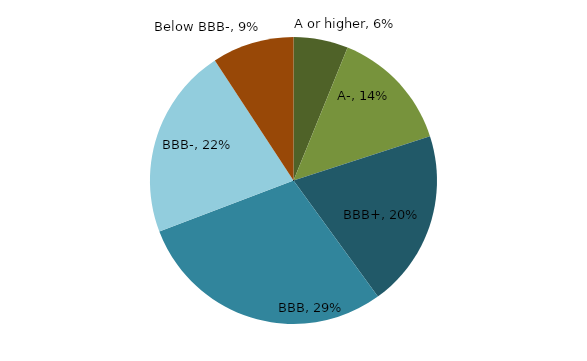
| Category | Series 0 |
|---|---|
| A or higher | 0.062 |
| A- | 0.138 |
| BBB+ | 0.2 |
| BBB | 0.292 |
| BBB- | 0.215 |
| Below BBB- | 0.092 |